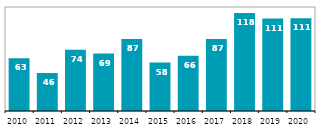
| Category | CZK billion |
|---|---|
| 2010 | 63.272 |
| 2011 | 45.697 |
| 2012 | 73.73 |
| 2013 | 68.997 |
| 2014 | 86.674 |
| 2015 | 58.16 |
| 2016 | 66.261 |
| 2017 | 86.543 |
| 2018 | 117.893 |
| 2019 | 111.03 |
| 2020 | 111.357 |